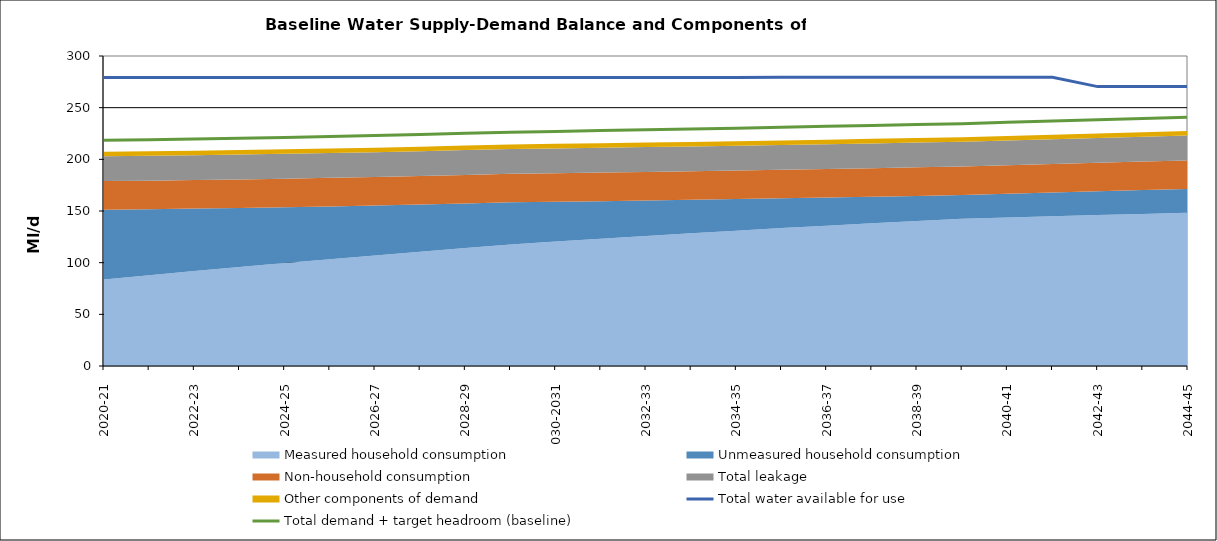
| Category | Total water available for use | Total demand + target headroom (baseline) |
|---|---|---|
| 0 | 279.234 | 218.399 |
| 1 | 279.234 | 218.924 |
| 2 | 279.244 | 219.63 |
| 3 | 279.244 | 220.377 |
| 4 | 279.254 | 221.041 |
| 5 | 279.264 | 222.011 |
| 6 | 279.264 | 222.981 |
| 7 | 279.274 | 223.923 |
| 8 | 279.284 | 225.17 |
| 9 | 279.284 | 226.155 |
| 10 | 279.294 | 227.035 |
| 11 | 279.304 | 227.828 |
| 12 | 279.304 | 228.517 |
| 13 | 279.314 | 229.346 |
| 14 | 279.314 | 230.019 |
| 15 | 279.324 | 231.046 |
| 16 | 279.334 | 231.934 |
| 17 | 279.334 | 232.779 |
| 18 | 279.344 | 233.65 |
| 19 | 279.354 | 234.545 |
| 20 | 279.354 | 235.807 |
| 21 | 279.364 | 237.078 |
| 22 | 270.374 | 238.338 |
| 23 | 270.374 | 239.585 |
| 24 | 270.384 | 240.82 |